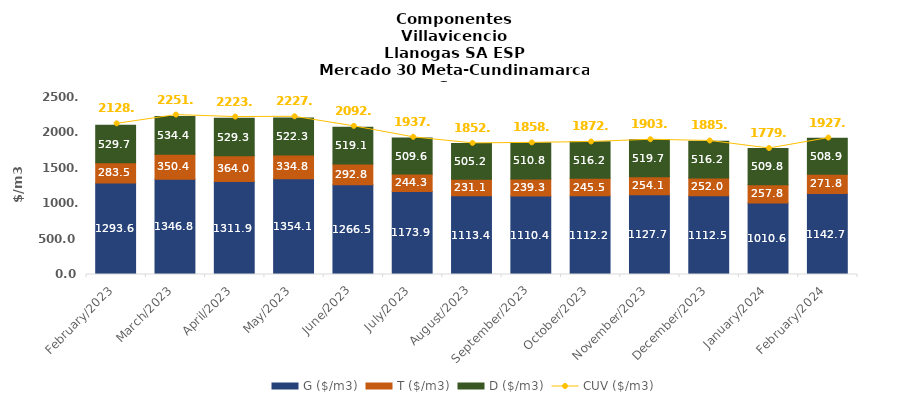
| Category | G ($/m3) | T ($/m3) | D ($/m3) |
|---|---|---|---|
| 2023-02-01 | 1293.59 | 283.45 | 529.74 |
| 2023-03-01 | 1346.83 | 350.38 | 534.44 |
| 2023-04-01 | 1311.89 | 364.02 | 529.26 |
| 2023-05-01 | 1354.14 | 334.83 | 522.32 |
| 2023-06-01 | 1266.52 | 292.77 | 519.06 |
| 2023-07-01 | 1173.91 | 244.29 | 509.62 |
| 2023-08-01 | 1113.38 | 231.11 | 505.17 |
| 2023-09-01 | 1110.42 | 239.27 | 510.83 |
| 2023-10-01 | 1112.24 | 245.53 | 516.22 |
| 2023-11-01 | 1127.7 | 254.12 | 519.71 |
| 2023-12-01 | 1112.49 | 252.02 | 516.22 |
| 2024-01-01 | 1010.63 | 257.82 | 509.77 |
| 2024-02-01 | 1142.71 | 271.82 | 508.9 |